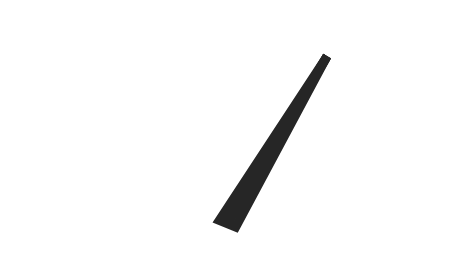
| Category | y |
|---|---|
| 71.89449139813301 | 44.951 |
| 51.798057283366504 | -0.876 |
| 48.201942716633496 | 0.876 |
| 71.89449139813301 | 44.951 |
| 50.0 | 0 |